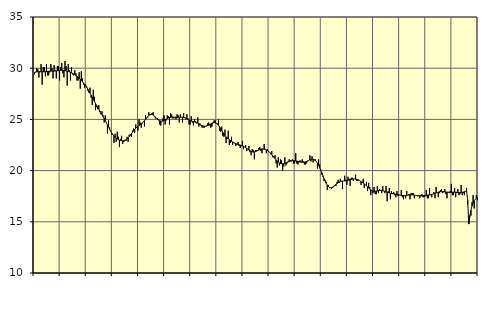
| Category | Tillverkning o utvinning, energi o miljö, SNI 05-33, 35-39 | Series 3 |
|---|---|---|
| nan | 29.4 | 29.59 |
| 87.0 | 29.6 | 29.63 |
| 87.0 | 30 | 29.65 |
| 87.0 | 29.9 | 29.65 |
| 87.0 | 29.1 | 29.65 |
| 87.0 | 29.7 | 29.65 |
| 87.0 | 30.4 | 29.65 |
| 87.0 | 28.4 | 29.65 |
| 87.0 | 30.1 | 29.65 |
| 87.0 | 30.1 | 29.65 |
| 87.0 | 29.2 | 29.66 |
| 87.0 | 30.4 | 29.67 |
| nan | 29.3 | 29.69 |
| 88.0 | 29.3 | 29.7 |
| 88.0 | 29.6 | 29.71 |
| 88.0 | 30.4 | 29.72 |
| 88.0 | 30 | 29.72 |
| 88.0 | 29 | 29.72 |
| 88.0 | 30.3 | 29.72 |
| 88.0 | 29.8 | 29.73 |
| 88.0 | 29 | 29.74 |
| 88.0 | 30.2 | 29.75 |
| 88.0 | 30.2 | 29.77 |
| 88.0 | 28.8 | 29.78 |
| nan | 30.1 | 29.79 |
| 89.0 | 30.5 | 29.8 |
| 89.0 | 29.5 | 29.8 |
| 89.0 | 29.1 | 29.79 |
| 89.0 | 30.7 | 29.76 |
| 89.0 | 30.2 | 29.74 |
| 89.0 | 28.3 | 29.71 |
| 89.0 | 30.4 | 29.68 |
| 89.0 | 29.8 | 29.64 |
| 89.0 | 28.8 | 29.6 |
| 89.0 | 30.1 | 29.55 |
| 89.0 | 29.4 | 29.49 |
| nan | 29.3 | 29.43 |
| 90.0 | 29.8 | 29.37 |
| 90.0 | 29.5 | 29.29 |
| 90.0 | 28.8 | 29.21 |
| 90.0 | 28.8 | 29.12 |
| 90.0 | 29.6 | 29.02 |
| 90.0 | 28 | 28.92 |
| 90.0 | 29.7 | 28.81 |
| 90.0 | 29 | 28.69 |
| 90.0 | 28.4 | 28.56 |
| 90.0 | 28.1 | 28.43 |
| 90.0 | 28.4 | 28.28 |
| nan | 28.2 | 28.12 |
| 91.0 | 27.8 | 27.95 |
| 91.0 | 27.6 | 27.76 |
| 91.0 | 28.1 | 27.57 |
| 91.0 | 27.1 | 27.37 |
| 91.0 | 26.4 | 27.17 |
| 91.0 | 27.9 | 26.97 |
| 91.0 | 27.2 | 26.77 |
| 91.0 | 25.9 | 26.57 |
| 91.0 | 26.2 | 26.37 |
| 91.0 | 26 | 26.19 |
| 91.0 | 26.4 | 26 |
| nan | 25.7 | 25.82 |
| 92.0 | 25.5 | 25.64 |
| 92.0 | 25.8 | 25.47 |
| 92.0 | 25.4 | 25.28 |
| 92.0 | 24.7 | 25.09 |
| 92.0 | 25.4 | 24.9 |
| 92.0 | 24.7 | 24.68 |
| 92.0 | 23.6 | 24.46 |
| 92.0 | 24.9 | 24.24 |
| 92.0 | 24.2 | 24.03 |
| 92.0 | 23.9 | 23.84 |
| 92.0 | 23.5 | 23.67 |
| nan | 23.5 | 23.51 |
| 93.0 | 22.7 | 23.38 |
| 93.0 | 23.6 | 23.26 |
| 93.0 | 22.8 | 23.17 |
| 93.0 | 23.8 | 23.09 |
| 93.0 | 23.3 | 23.03 |
| 93.0 | 22.3 | 22.98 |
| 93.0 | 23.1 | 22.95 |
| 93.0 | 23.4 | 22.92 |
| 93.0 | 22.6 | 22.91 |
| 93.0 | 22.8 | 22.92 |
| 93.0 | 23 | 22.94 |
| nan | 22.9 | 23 |
| 94.0 | 23.3 | 23.08 |
| 94.0 | 22.8 | 23.18 |
| 94.0 | 23.5 | 23.31 |
| 94.0 | 23.5 | 23.44 |
| 94.0 | 23.3 | 23.59 |
| 94.0 | 23.9 | 23.74 |
| 94.0 | 24.1 | 23.88 |
| 94.0 | 23.7 | 24.02 |
| 94.0 | 24.5 | 24.14 |
| 94.0 | 24.2 | 24.24 |
| 94.0 | 23.9 | 24.33 |
| nan | 25 | 24.41 |
| 95.0 | 24.7 | 24.49 |
| 95.0 | 24.2 | 24.57 |
| 95.0 | 24.6 | 24.66 |
| 95.0 | 24.8 | 24.76 |
| 95.0 | 24.3 | 24.88 |
| 95.0 | 25.4 | 25.01 |
| 95.0 | 25.1 | 25.15 |
| 95.0 | 25.2 | 25.27 |
| 95.0 | 25.7 | 25.38 |
| 95.0 | 25.5 | 25.46 |
| 95.0 | 25.5 | 25.5 |
| nan | 25.6 | 25.49 |
| 96.0 | 25.7 | 25.43 |
| 96.0 | 25.3 | 25.34 |
| 96.0 | 25.1 | 25.23 |
| 96.0 | 25.1 | 25.12 |
| 96.0 | 25.1 | 25.01 |
| 96.0 | 25 | 24.93 |
| 96.0 | 24.5 | 24.87 |
| 96.0 | 24.4 | 24.84 |
| 96.0 | 24.8 | 24.83 |
| 96.0 | 25.1 | 24.86 |
| 96.0 | 25.4 | 24.91 |
| nan | 24.5 | 24.97 |
| 97.0 | 24.9 | 25.03 |
| 97.0 | 25.4 | 25.09 |
| 97.0 | 25.3 | 25.14 |
| 97.0 | 24.5 | 25.17 |
| 97.0 | 25.6 | 25.2 |
| 97.0 | 25.5 | 25.22 |
| 97.0 | 25.1 | 25.22 |
| 97.0 | 25.1 | 25.22 |
| 97.0 | 25.2 | 25.22 |
| 97.0 | 25 | 25.21 |
| 97.0 | 25.5 | 25.2 |
| nan | 25.4 | 25.2 |
| 98.0 | 24.7 | 25.2 |
| 98.0 | 25.5 | 25.21 |
| 98.0 | 25.2 | 25.21 |
| 98.0 | 24.7 | 25.21 |
| 98.0 | 25.6 | 25.19 |
| 98.0 | 25.2 | 25.16 |
| 98.0 | 25 | 25.11 |
| 98.0 | 25.5 | 25.06 |
| 98.0 | 25.1 | 25 |
| 98.0 | 24.5 | 24.94 |
| 98.0 | 24.5 | 24.89 |
| nan | 25.3 | 24.85 |
| 99.0 | 24.7 | 24.81 |
| 99.0 | 24.4 | 24.79 |
| 99.0 | 25 | 24.76 |
| 99.0 | 24.8 | 24.73 |
| 99.0 | 24.6 | 24.69 |
| 99.0 | 25.2 | 24.63 |
| 99.0 | 24.3 | 24.57 |
| 99.0 | 24.6 | 24.5 |
| 99.0 | 24.4 | 24.44 |
| 99.0 | 24.2 | 24.39 |
| 99.0 | 24.2 | 24.35 |
| nan | 24.2 | 24.34 |
| 0.0 | 24.3 | 24.33 |
| 0.0 | 24.4 | 24.35 |
| 0.0 | 24.6 | 24.39 |
| 0.0 | 24.7 | 24.44 |
| 0.0 | 24.4 | 24.5 |
| 0.0 | 24.2 | 24.56 |
| 0.0 | 24.3 | 24.62 |
| 0.0 | 24.7 | 24.66 |
| 0.0 | 24.9 | 24.68 |
| 0.0 | 24.9 | 24.67 |
| 0.0 | 24.6 | 24.62 |
| nan | 24.6 | 24.54 |
| 1.0 | 25 | 24.42 |
| 1.0 | 23.9 | 24.27 |
| 1.0 | 23.8 | 24.1 |
| 1.0 | 24.3 | 23.92 |
| 1.0 | 23.4 | 23.74 |
| 1.0 | 23.3 | 23.57 |
| 1.0 | 24 | 23.43 |
| 1.0 | 22.7 | 23.3 |
| 1.0 | 23.1 | 23.19 |
| 1.0 | 23.9 | 23.1 |
| 1.0 | 22.5 | 23.01 |
| nan | 22.7 | 22.93 |
| 2.0 | 23.3 | 22.86 |
| 2.0 | 22.5 | 22.79 |
| 2.0 | 22.8 | 22.73 |
| 2.0 | 22.7 | 22.67 |
| 2.0 | 22.4 | 22.63 |
| 2.0 | 22.6 | 22.58 |
| 2.0 | 22.8 | 22.55 |
| 2.0 | 22.4 | 22.52 |
| 2.0 | 22.2 | 22.49 |
| 2.0 | 22.5 | 22.45 |
| 2.0 | 22.9 | 22.41 |
| nan | 22.1 | 22.37 |
| 3.0 | 22.3 | 22.31 |
| 3.0 | 22.5 | 22.25 |
| 3.0 | 21.9 | 22.17 |
| 3.0 | 22.1 | 22.09 |
| 3.0 | 22.4 | 22 |
| 3.0 | 21.8 | 21.93 |
| 3.0 | 21.5 | 21.87 |
| 3.0 | 22.1 | 21.83 |
| 3.0 | 22 | 21.82 |
| 3.0 | 21.1 | 21.83 |
| 3.0 | 22 | 21.85 |
| nan | 22 | 21.9 |
| 4.0 | 22 | 21.95 |
| 4.0 | 22.2 | 22.01 |
| 4.0 | 22.3 | 22.06 |
| 4.0 | 21.9 | 22.1 |
| 4.0 | 21.7 | 22.12 |
| 4.0 | 22.1 | 22.12 |
| 4.0 | 22.6 | 22.1 |
| 4.0 | 22.1 | 22.07 |
| 4.0 | 21.7 | 22.02 |
| 4.0 | 22.1 | 21.97 |
| 4.0 | 21.8 | 21.89 |
| nan | 21.8 | 21.8 |
| 5.0 | 21.6 | 21.69 |
| 5.0 | 21.9 | 21.57 |
| 5.0 | 21.3 | 21.44 |
| 5.0 | 21.4 | 21.3 |
| 5.0 | 21.5 | 21.17 |
| 5.0 | 20.7 | 21.05 |
| 5.0 | 20.3 | 20.93 |
| 5.0 | 21.3 | 20.83 |
| 5.0 | 20.5 | 20.75 |
| 5.0 | 21.1 | 20.69 |
| 5.0 | 21 | 20.67 |
| nan | 20 | 20.66 |
| 6.0 | 20.4 | 20.68 |
| 6.0 | 21.3 | 20.71 |
| 6.0 | 20.5 | 20.75 |
| 6.0 | 20.7 | 20.79 |
| 6.0 | 20.9 | 20.84 |
| 6.0 | 21.1 | 20.89 |
| 6.0 | 21 | 20.93 |
| 6.0 | 20.9 | 20.96 |
| 6.0 | 21.1 | 20.97 |
| 6.0 | 20.7 | 20.97 |
| 6.0 | 20.7 | 20.96 |
| nan | 21.7 | 20.95 |
| 7.0 | 20.7 | 20.93 |
| 7.0 | 20.6 | 20.91 |
| 7.0 | 20.8 | 20.88 |
| 7.0 | 21 | 20.85 |
| 7.0 | 20.9 | 20.83 |
| 7.0 | 21.1 | 20.81 |
| 7.0 | 20.9 | 20.81 |
| 7.0 | 20.6 | 20.83 |
| 7.0 | 20.6 | 20.86 |
| 7.0 | 20.7 | 20.9 |
| 7.0 | 20.9 | 20.95 |
| nan | 21 | 21 |
| 8.0 | 21.5 | 21.05 |
| 8.0 | 20.9 | 21.09 |
| 8.0 | 21.4 | 21.11 |
| 8.0 | 20.8 | 21.11 |
| 8.0 | 21 | 21.07 |
| 8.0 | 21.1 | 21 |
| 8.0 | 20.9 | 20.88 |
| 8.0 | 20.2 | 20.72 |
| 8.0 | 21.1 | 20.52 |
| 8.0 | 20.6 | 20.29 |
| 8.0 | 20.1 | 20.04 |
| nan | 19.6 | 19.78 |
| 9.0 | 19.4 | 19.5 |
| 9.0 | 19 | 19.23 |
| 9.0 | 19.1 | 18.98 |
| 9.0 | 18.9 | 18.76 |
| 9.0 | 18.1 | 18.58 |
| 9.0 | 18.6 | 18.45 |
| 9.0 | 18.4 | 18.36 |
| 9.0 | 18.3 | 18.33 |
| 9.0 | 18.2 | 18.35 |
| 9.0 | 18.3 | 18.4 |
| 9.0 | 18.5 | 18.47 |
| nan | 18.6 | 18.56 |
| 10.0 | 18.5 | 18.65 |
| 10.0 | 18.9 | 18.73 |
| 10.0 | 19.1 | 18.81 |
| 10.0 | 18.8 | 18.87 |
| 10.0 | 19.2 | 18.92 |
| 10.0 | 19 | 18.95 |
| 10.0 | 18.2 | 18.97 |
| 10.0 | 19 | 18.98 |
| 10.0 | 19.5 | 18.99 |
| 10.0 | 19.1 | 19 |
| 10.0 | 18.6 | 19.02 |
| nan | 19.4 | 19.05 |
| 11.0 | 19.2 | 19.08 |
| 11.0 | 18.5 | 19.11 |
| 11.0 | 19.3 | 19.14 |
| 11.0 | 19.3 | 19.16 |
| 11.0 | 19 | 19.18 |
| 11.0 | 19.2 | 19.18 |
| 11.0 | 19.6 | 19.17 |
| 11.0 | 19 | 19.15 |
| 11.0 | 19 | 19.11 |
| 11.0 | 19.1 | 19.06 |
| 11.0 | 19 | 19 |
| nan | 18.6 | 18.93 |
| 12.0 | 18.9 | 18.86 |
| 12.0 | 19.2 | 18.78 |
| 12.0 | 18.3 | 18.7 |
| 12.0 | 18.6 | 18.61 |
| 12.0 | 18.9 | 18.51 |
| 12.0 | 18 | 18.41 |
| 12.0 | 18.8 | 18.31 |
| 12.0 | 18.4 | 18.21 |
| 12.0 | 17.6 | 18.12 |
| 12.0 | 18 | 18.05 |
| 12.0 | 17.8 | 18.01 |
| nan | 18.4 | 17.98 |
| 13.0 | 17.7 | 17.97 |
| 13.0 | 17.7 | 17.99 |
| 13.0 | 18.5 | 18.01 |
| 13.0 | 17.8 | 18.04 |
| 13.0 | 18.2 | 18.06 |
| 13.0 | 18.1 | 18.07 |
| 13.0 | 17.8 | 18.07 |
| 13.0 | 18.5 | 18.04 |
| 13.0 | 18 | 18.01 |
| 13.0 | 17.8 | 17.97 |
| 13.0 | 18.5 | 17.93 |
| nan | 17 | 17.89 |
| 14.0 | 18 | 17.85 |
| 14.0 | 18.3 | 17.82 |
| 14.0 | 17.2 | 17.78 |
| 14.0 | 18 | 17.76 |
| 14.0 | 17.8 | 17.74 |
| 14.0 | 17.9 | 17.73 |
| 14.0 | 17.6 | 17.72 |
| 14.0 | 17.4 | 17.7 |
| 14.0 | 18 | 17.68 |
| 14.0 | 17.5 | 17.65 |
| 14.0 | 17.6 | 17.63 |
| nan | 17.6 | 17.6 |
| 15.0 | 18.1 | 17.58 |
| 15.0 | 17.4 | 17.57 |
| 15.0 | 17.2 | 17.56 |
| 15.0 | 17.6 | 17.56 |
| 15.0 | 17.3 | 17.57 |
| 15.0 | 18 | 17.58 |
| 15.0 | 17.6 | 17.59 |
| 15.0 | 17.7 | 17.61 |
| 15.0 | 17.2 | 17.63 |
| 15.0 | 17.8 | 17.63 |
| 15.0 | 17.8 | 17.63 |
| nan | 17.8 | 17.63 |
| 16.0 | 17.3 | 17.61 |
| 16.0 | 17.6 | 17.59 |
| 16.0 | 17.6 | 17.57 |
| 16.0 | 17.5 | 17.55 |
| 16.0 | 17.6 | 17.54 |
| 16.0 | 17.3 | 17.53 |
| 16.0 | 17.6 | 17.53 |
| 16.0 | 17.7 | 17.53 |
| 16.0 | 17.4 | 17.55 |
| 16.0 | 17.4 | 17.56 |
| 16.0 | 17.5 | 17.58 |
| nan | 18.1 | 17.59 |
| 17.0 | 17.3 | 17.61 |
| 17.0 | 17.3 | 17.62 |
| 17.0 | 18.3 | 17.64 |
| 17.0 | 17.6 | 17.66 |
| 17.0 | 17.4 | 17.68 |
| 17.0 | 17.7 | 17.71 |
| 17.0 | 17.9 | 17.74 |
| 17.0 | 17.3 | 17.77 |
| 17.0 | 18.4 | 17.82 |
| 17.0 | 17.9 | 17.86 |
| 17.0 | 17.4 | 17.9 |
| nan | 17.8 | 17.93 |
| 18.0 | 18.1 | 17.94 |
| 18.0 | 18.2 | 17.94 |
| 18.0 | 17.8 | 17.94 |
| 18.0 | 18 | 17.92 |
| 18.0 | 18.2 | 17.91 |
| 18.0 | 17.7 | 17.9 |
| 18.0 | 17.3 | 17.9 |
| 18.0 | 17.9 | 17.89 |
| 18.0 | 17.8 | 17.89 |
| 18.0 | 18 | 17.89 |
| 18.0 | 18.7 | 17.89 |
| nan | 17.6 | 17.9 |
| 19.0 | 17.6 | 17.9 |
| 19.0 | 18.3 | 17.9 |
| 19.0 | 17.4 | 17.89 |
| 19.0 | 17.8 | 17.88 |
| 19.0 | 18.2 | 17.86 |
| 19.0 | 17.6 | 17.86 |
| 19.0 | 17.7 | 17.86 |
| 19.0 | 18.6 | 17.87 |
| 19.0 | 17.6 | 17.88 |
| 19.0 | 17.8 | 17.91 |
| 19.0 | 17.6 | 17.94 |
| nan | 18 | 17.98 |
| 20.0 | 18.3 | 18.04 |
| 20.0 | 16.7 | 17.11 |
| 20.0 | 15.1 | 14.78 |
| 20.0 | 15.6 | 15.57 |
| 20.0 | 15.6 | 16.14 |
| 20.0 | 16.9 | 16.55 |
| 20.0 | 17.6 | 16.84 |
| 20.0 | 16.3 | 17.05 |
| 20.0 | 17.2 | 17.2 |
| 20.0 | 17.6 | 17.3 |
| 20.0 | 17.1 | 17.38 |